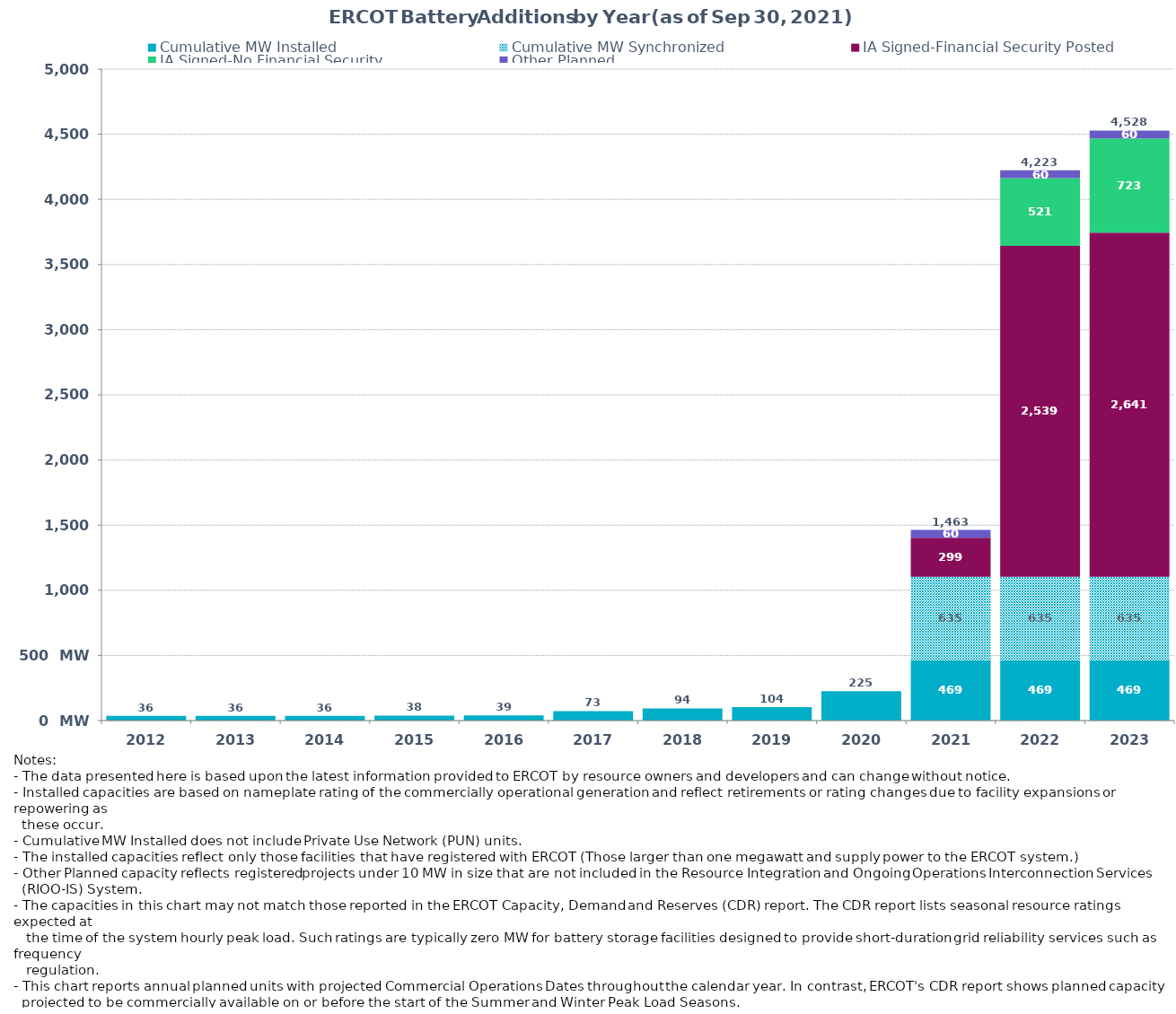
| Category | Cumulative MW Installed | Cumulative MW Synchronized | IA Signed-Financial Security Posted  | IA Signed-No Financial Security  | Other Planned | Cumulative Installed and Planned |
|---|---|---|---|---|---|---|
| 2012.0 | 36 | 0 | 0 | 0 | 0 | 36 |
| 2013.0 | 36 | 0 | 0 | 0 | 0 | 36 |
| 2014.0 | 36 | 0 | 0 | 0 | 0 | 36 |
| 2015.0 | 38 | 0 | 0 | 0 | 0 | 38 |
| 2016.0 | 39 | 0 | 0 | 0 | 0 | 39 |
| 2017.0 | 72.5 | 0 | 0 | 0 | 0 | 72.5 |
| 2018.0 | 93.8 | 0 | 0 | 0 | 0 | 93.8 |
| 2019.0 | 103.7 | 0 | 0 | 0 | 0 | 103.7 |
| 2020.0 | 225.4 | 0 | 0 | 0 | 0 | 225.4 |
| 2021.0 | 468.73 | 635.02 | 299.3 | 0 | 59.7 | 1462.75 |
| 2022.0 | 468.73 | 635.02 | 2538.94 | 520.99 | 59.7 | 4223.38 |
| 2023.0 | 468.73 | 635.02 | 2641.36 | 723.49 | 59.7 | 4528.3 |